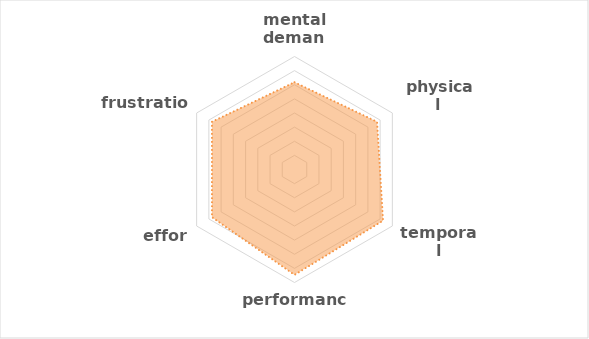
| Category | Series 0 |
|---|---|
| mental demand | 1.235 |
|  physical demand | 1.35 |
| temporal demand  | 1.448 |
| performance | 1.492 |
|  effort | 1.35 |
| frustration | 1.35 |